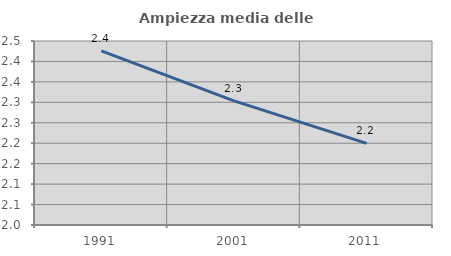
| Category | Ampiezza media delle famiglie |
|---|---|
| 1991.0 | 2.426 |
| 2001.0 | 2.304 |
| 2011.0 | 2.2 |